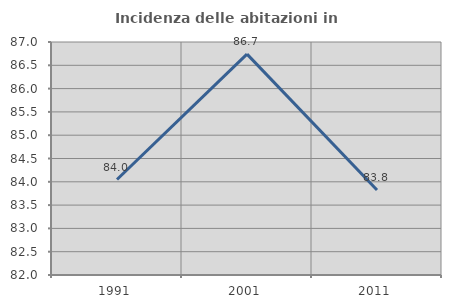
| Category | Incidenza delle abitazioni in proprietà  |
|---|---|
| 1991.0 | 84.049 |
| 2001.0 | 86.74 |
| 2011.0 | 83.824 |